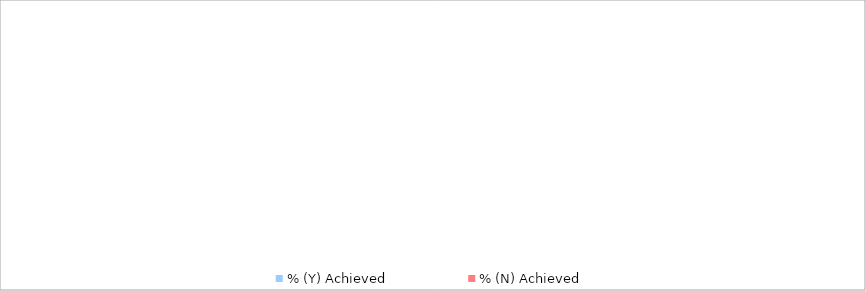
| Category | % (Y) Achieved | % (N) Achieved |
|---|---|---|
| % of pregnant women attending fourth ANC visit | 0 | 1 |
| % of skilled deliveries within the facility catchment population | 0 | 1 |
| % of deliveries with accurately filled partographs | 0 | 1 |
| % of Mother-newborn pairs reviewed  by health care provider 7-14 days of birth | 0 | 1 |
| % of pregnant women whose partners have been tested for HIV or who are known positive. | 0 | 1 |
| % of HIV-infected pregnant women receiving  HAART  | 0 | 1 |
| % HEI who received HIV DNA PCR testing by age 6-8 weeks and results are available | 0 | 1 |
| % HIV exposed infants on exclusive breast  feeding at age 6 months | 0 | 1 |
| % HIV infected mother and HIV-exposed baby pair (0-18 months) in active care among facility registered | 0 | 1 |
| % HIV infected mother and HIV-exposed baby pair (0-18 months) in active care among population estimate | 0 | 1 |
| % HIV exposed infants diagnosed with HIV between 0 and 18 months | 0 | 1 |